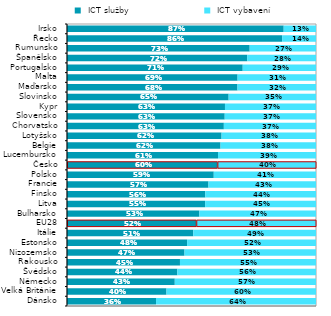
| Category |  ICT služby |  ICT vybavení |
|---|---|---|
| Dánsko | 0.358 | 0.642 |
| Velká Británie | 0.4 | 0.6 |
| Německo | 0.433 | 0.567 |
| Švédsko | 0.443 | 0.557 |
| Rakousko | 0.454 | 0.546 |
| Nizozemsko | 0.472 | 0.528 |
| Estonsko | 0.482 | 0.518 |
| Itálie | 0.507 | 0.493 |
| EU28 | 0.519 | 0.481 |
| Bulharsko | 0.532 | 0.468 |
| Litva | 0.555 | 0.445 |
| Finsko | 0.555 | 0.445 |
| Francie | 0.568 | 0.432 |
| Polsko | 0.589 | 0.411 |
| Česko | 0.604 | 0.396 |
| Lucembursko | 0.607 | 0.393 |
| Belgie | 0.617 | 0.383 |
| Lotyšsko | 0.621 | 0.379 |
| Chorvatsko | 0.63 | 0.37 |
| Slovensko | 0.633 | 0.367 |
| Kypr | 0.634 | 0.366 |
| Slovinsko | 0.649 | 0.351 |
| Maďarsko | 0.685 | 0.315 |
| Malta | 0.685 | 0.315 |
| Portugalsko | 0.706 | 0.294 |
| Španělsko | 0.724 | 0.276 |
| Rumunsko | 0.734 | 0.266 |
| Řecko | 0.864 | 0.136 |
| Irsko | 0.87 | 0.13 |